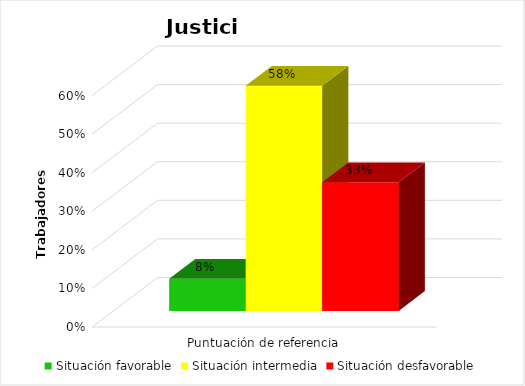
| Category | Situación favorable | Situación intermedia | Situación desfavorable |
|---|---|---|---|
| 0 | 0.083 | 0.583 | 0.333 |